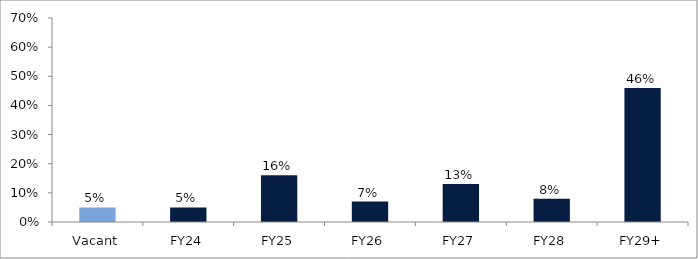
| Category | Series 0 |
|---|---|
| Vacant | 0.05 |
| FY24 | 0.05 |
| FY25 | 0.16 |
| FY26 | 0.07 |
| FY27 | 0.13 |
| FY28 | 0.08 |
| FY29+ | 0.46 |